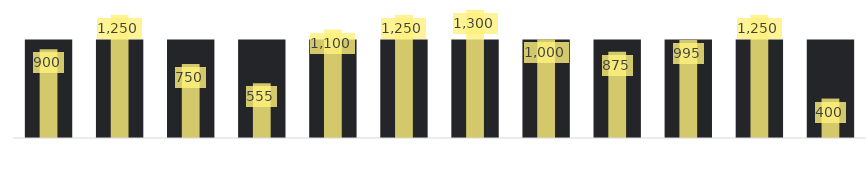
| Category | Summe von Ziel |
|---|---|
| 1 | 1000 |
| 2 | 1000 |
| 3 | 1000 |
| 4 | 1000 |
| 5 | 1000 |
| 6 | 1000 |
| 7 | 1000 |
| 8 | 1000 |
| 9 | 1000 |
| 10 | 1000 |
| 11 | 1000 |
| 12 | 1000 |